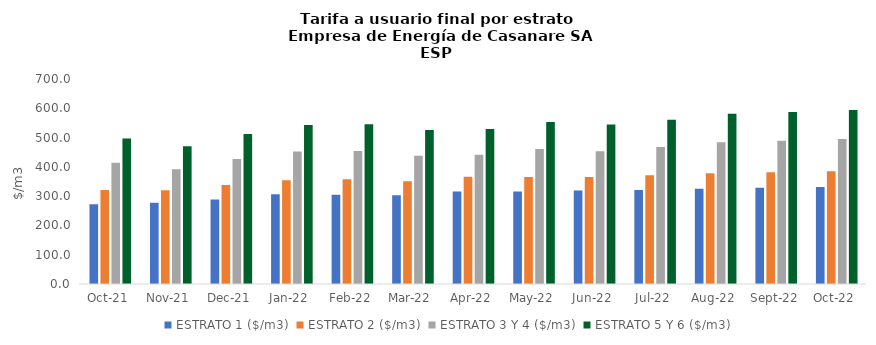
| Category | ESTRATO 1 ($/m3) | ESTRATO 2 ($/m3) | ESTRATO 3 Y 4 ($/m3) | ESTRATO 5 Y 6 ($/m3) |
|---|---|---|---|---|
| 2021-10-01 | 272.25 | 321 | 413.78 | 496.536 |
| 2021-11-01 | 277.36 | 320.28 | 391.96 | 470.352 |
| 2021-12-01 | 288.49 | 338.1 | 426.54 | 511.848 |
| 2022-01-01 | 306.33 | 354.34 | 452.26 | 542.712 |
| 2022-02-01 | 305.06 | 357.43 | 454.22 | 545.064 |
| 2022-03-01 | 303.35 | 350.56 | 438.32 | 525.984 |
| 2022-04-01 | 315.74 | 365.83 | 441.08 | 529.296 |
| 2022-05-01 | 315.8 | 365.2 | 460.82 | 552.984 |
| 2022-06-01 | 319.19 | 365.21 | 453.71 | 544.452 |
| 2022-07-01 | 320.83 | 371.63 | 467.55 | 561.06 |
| 2022-08-01 | 325.09 | 378 | 484.31 | 581.172 |
| 2022-09-01 | 328.41 | 381.87 | 489.35 | 587.22 |
| 2022-10-01 | 331.46 | 385.42 | 495.2 | 594.24 |